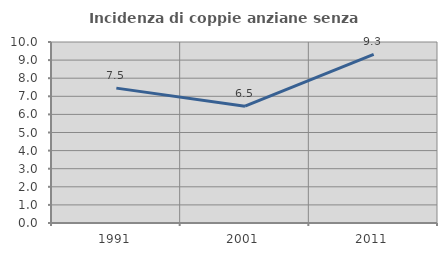
| Category | Incidenza di coppie anziane senza figli  |
|---|---|
| 1991.0 | 7.451 |
| 2001.0 | 6.452 |
| 2011.0 | 9.31 |